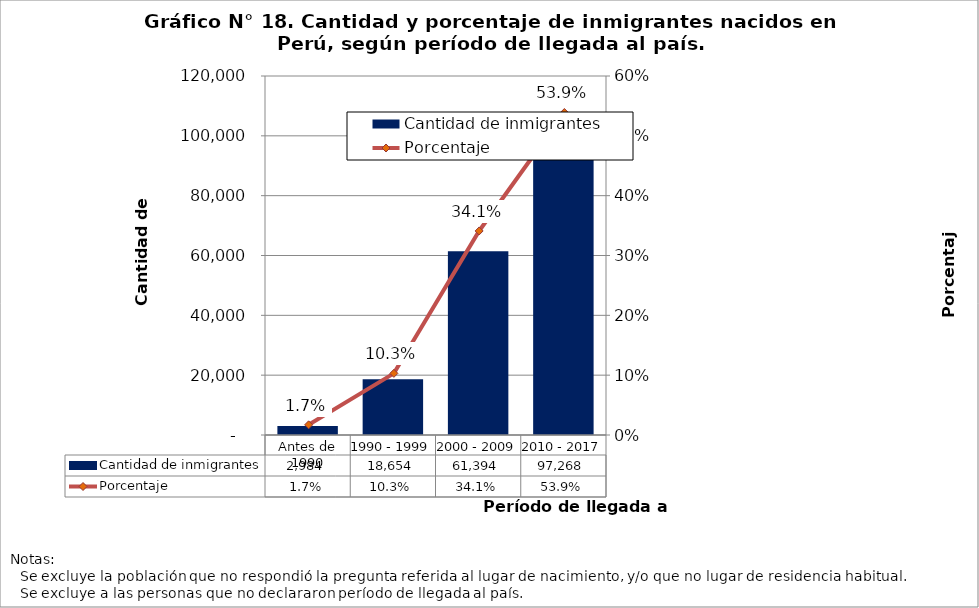
| Category | Cantidad de inmigrantes |
|---|---|
| Antes de 1990 | 2984 |
| 1990 - 1999 | 18654 |
| 2000 - 2009 | 61394 |
| 2010 - 2017 | 97268 |